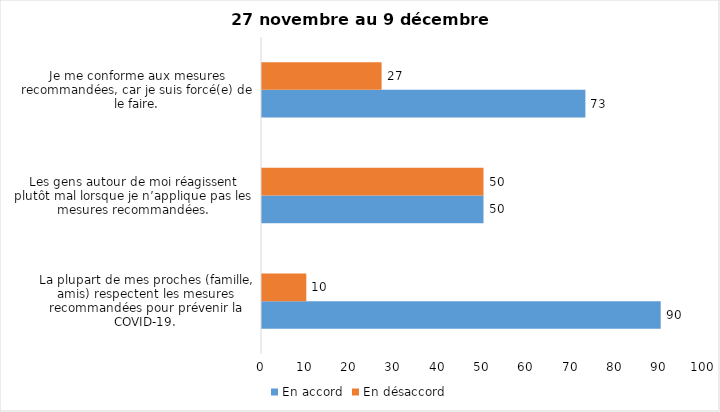
| Category | En accord | En désaccord |
|---|---|---|
| La plupart de mes proches (famille, amis) respectent les mesures recommandées pour prévenir la COVID-19. | 90 | 10 |
| Les gens autour de moi réagissent plutôt mal lorsque je n’applique pas les mesures recommandées. | 50 | 50 |
| Je me conforme aux mesures recommandées, car je suis forcé(e) de le faire. | 73 | 27 |